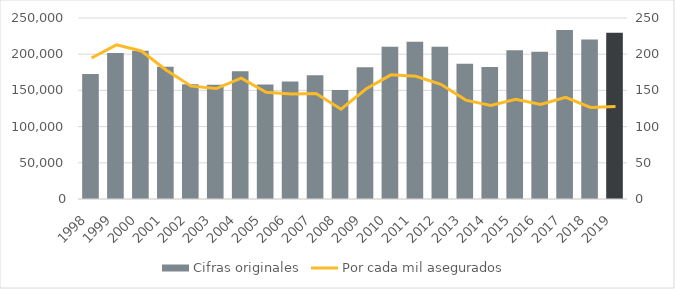
| Category | Cifras originales |
|---|---|
| 1998.0 | 172683 |
| 1999.0 | 201576 |
| 2000.0 | 204653 |
| 2001.0 | 182627 |
| 2002.0 | 158645 |
| 2003.0 | 157748 |
| 2004.0 | 176303 |
| 2005.0 | 158218 |
| 2006.0 | 162359 |
| 2007.0 | 170985 |
| 2008.0 | 150597 |
| 2009.0 | 182135 |
| 2010.0 | 210305 |
| 2011.0 | 217259 |
| 2012.0 | 210243 |
| 2013.0 | 186879 |
| 2014.0 | 182400 |
| 2015.0 | 205616 |
| 2016.0 | 203415 |
| 2017.0 | 233285 |
| 2018.0 | 220469 |
| 2019.0 | 229565 |